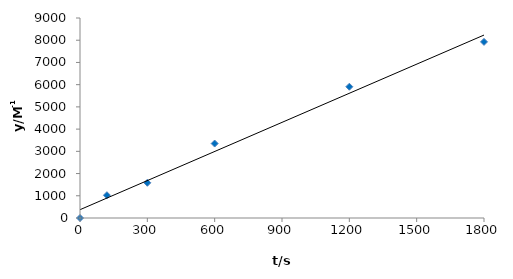
| Category | Series 0 |
|---|---|
| 0.0 | 0 |
| 120.0 | 1025.405 |
| 300.0 | 1584.824 |
| 600.0 | 3349.852 |
| 1200.0 | 5907.185 |
| 1800.0 | 7925.268 |